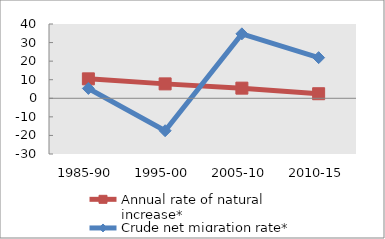
| Category | Annual rate of natural increase* | Crude net migration rate* |
|---|---|---|
| 1985-90 | 10.463 | 5.303 |
| 1995-00 | 7.757 | -17.467 |
| 2005-10 | 5.459 | 34.693 |
| 2010-15 | 2.453 | 21.89 |